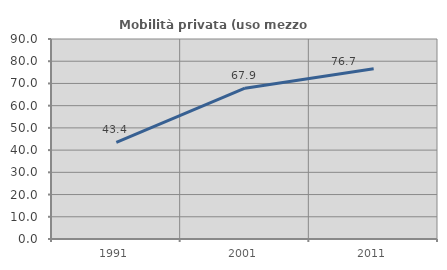
| Category | Mobilità privata (uso mezzo privato) |
|---|---|
| 1991.0 | 43.435 |
| 2001.0 | 67.882 |
| 2011.0 | 76.653 |